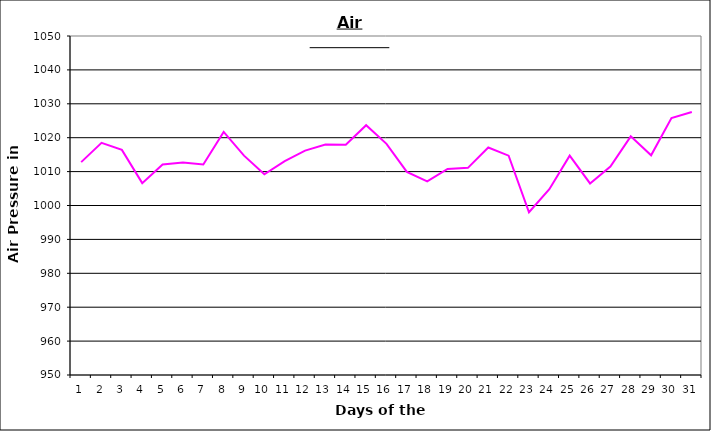
| Category | Series 0 |
|---|---|
| 0 | 1012.8 |
| 1 | 1018.5 |
| 2 | 1016.4 |
| 3 | 1006.6 |
| 4 | 1012.1 |
| 5 | 1012.7 |
| 6 | 1012.1 |
| 7 | 1021.7 |
| 8 | 1014.7 |
| 9 | 1009.2 |
| 10 | 1013.1 |
| 11 | 1016.2 |
| 12 | 1018 |
| 13 | 1017.9 |
| 14 | 1023.7 |
| 15 | 1018.2 |
| 16 | 1009.9 |
| 17 | 1007.1 |
| 18 | 1010.8 |
| 19 | 1011.1 |
| 20 | 1017.1 |
| 21 | 1014.7 |
| 22 | 998 |
| 23 | 1004.8 |
| 24 | 1014.7 |
| 25 | 1006.5 |
| 26 | 1011.5 |
| 27 | 1020.4 |
| 28 | 1014.8 |
| 29 | 1025.8 |
| 30 | 1027.6 |